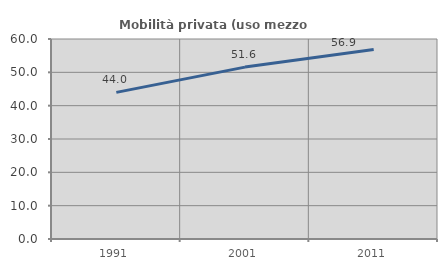
| Category | Mobilità privata (uso mezzo privato) |
|---|---|
| 1991.0 | 43.986 |
| 2001.0 | 51.57 |
| 2011.0 | 56.877 |